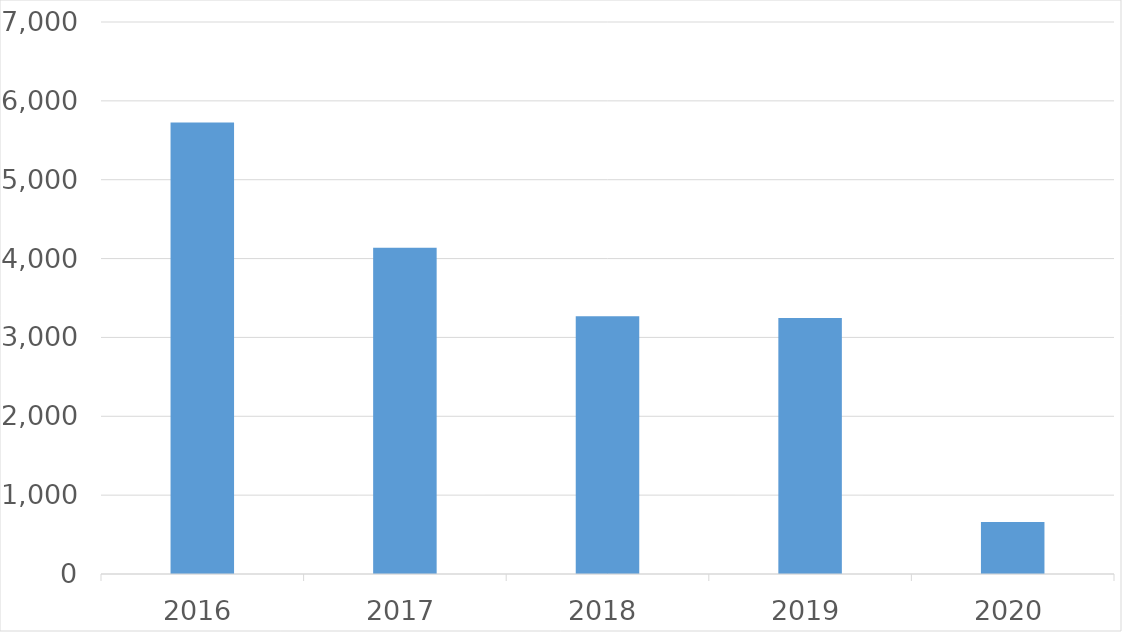
| Category | Series 0 |
|---|---|
| 2016 | 5725 |
| 2017 | 4138 |
| 2018 | 3267 |
| 2019 | 3245 |
| 2020 | 659 |